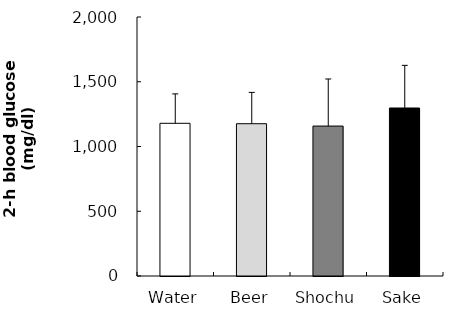
| Category | Series 0 |
|---|---|
| Water | 1179.096 |
| Beer | 1175.927 |
| Shochu | 1157.877 |
| Sake | 1297.207 |